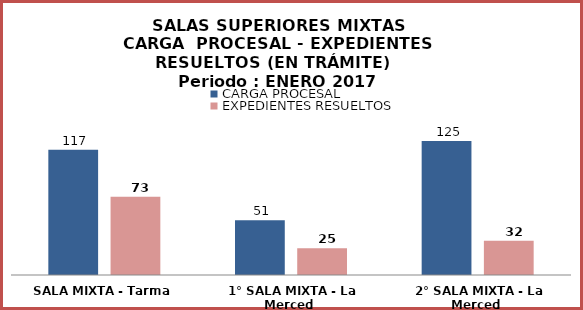
| Category | CARGA PROCESAL | EXPEDIENTES RESUELTOS |
|---|---|---|
| SALA MIXTA - Tarma | 117 | 73 |
| 1° SALA MIXTA - La Merced | 51 | 25 |
| 2° SALA MIXTA - La Merced | 125 | 32 |